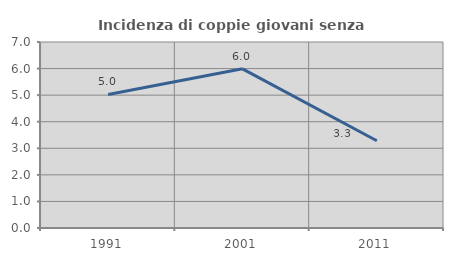
| Category | Incidenza di coppie giovani senza figli |
|---|---|
| 1991.0 | 5.027 |
| 2001.0 | 5.99 |
| 2011.0 | 3.282 |